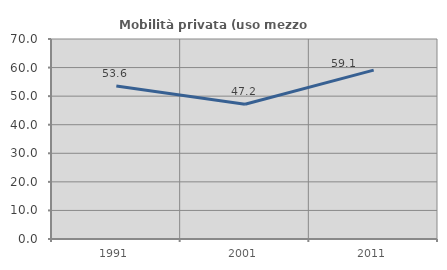
| Category | Mobilità privata (uso mezzo privato) |
|---|---|
| 1991.0 | 53.571 |
| 2001.0 | 47.17 |
| 2011.0 | 59.091 |